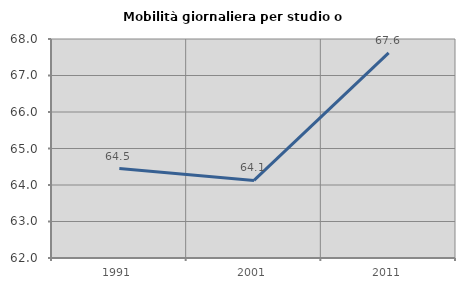
| Category | Mobilità giornaliera per studio o lavoro |
|---|---|
| 1991.0 | 64.452 |
| 2001.0 | 64.126 |
| 2011.0 | 67.622 |